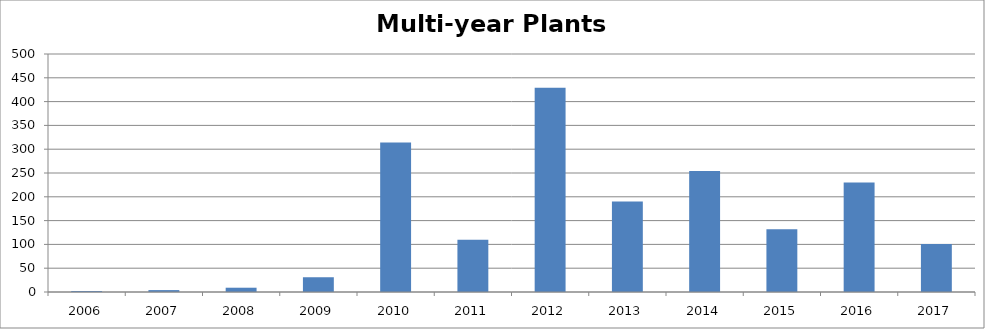
| Category | Multi-year Plants Observations |
|---|---|
| 2006.0 | 2 |
| 2007.0 | 4 |
| 2008.0 | 9 |
| 2009.0 | 31 |
| 2010.0 | 314 |
| 2011.0 | 110 |
| 2012.0 | 429 |
| 2013.0 | 190 |
| 2014.0 | 254 |
| 2015.0 | 132 |
| 2016.0 | 230 |
| 2017.0 | 101 |